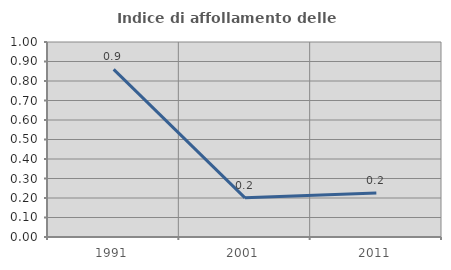
| Category | Indice di affollamento delle abitazioni  |
|---|---|
| 1991.0 | 0.86 |
| 2001.0 | 0.201 |
| 2011.0 | 0.226 |